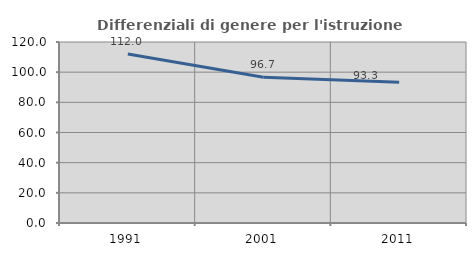
| Category | Differenziali di genere per l'istruzione superiore |
|---|---|
| 1991.0 | 112.029 |
| 2001.0 | 96.696 |
| 2011.0 | 93.33 |